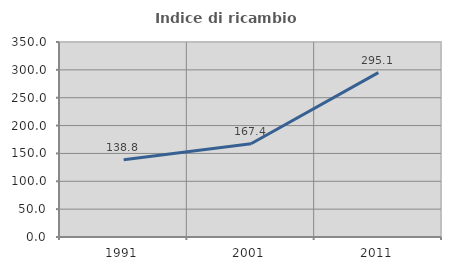
| Category | Indice di ricambio occupazionale  |
|---|---|
| 1991.0 | 138.783 |
| 2001.0 | 167.355 |
| 2011.0 | 295.07 |